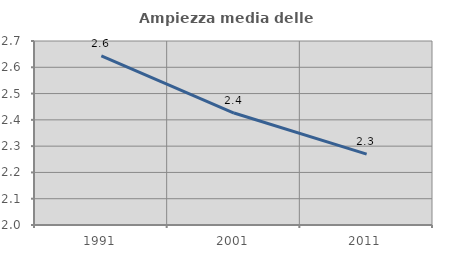
| Category | Ampiezza media delle famiglie |
|---|---|
| 1991.0 | 2.643 |
| 2001.0 | 2.426 |
| 2011.0 | 2.269 |